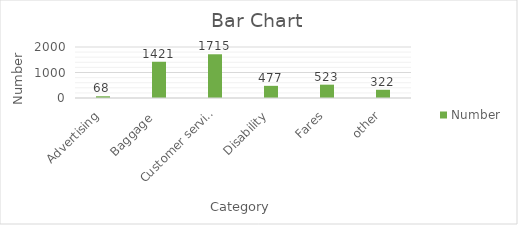
| Category | Number |
|---|---|
| Advertising | 68 |
| Baggage  | 1421 |
| Customer service | 1715 |
| Disability | 477 |
| Fares | 523 |
| other | 322 |